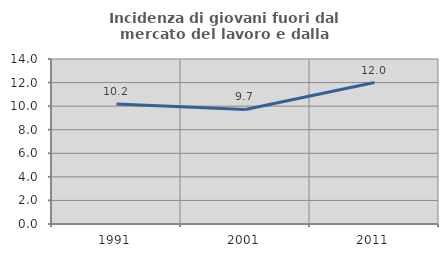
| Category | Incidenza di giovani fuori dal mercato del lavoro e dalla formazione  |
|---|---|
| 1991.0 | 10.185 |
| 2001.0 | 9.722 |
| 2011.0 | 12 |